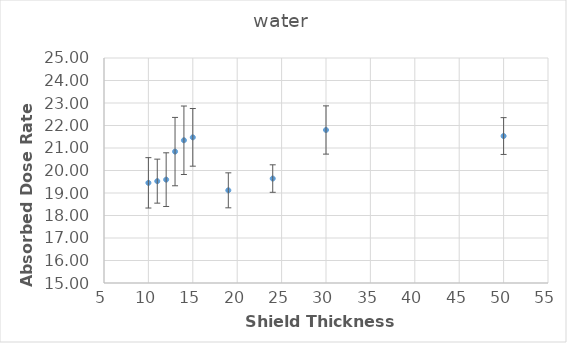
| Category | water |
|---|---|
| 10.0 | 19.451 |
| 11.0 | 19.527 |
| 12.0 | 19.593 |
| 13.0 | 20.84 |
| 14.0 | 21.344 |
| 15.0 | 21.473 |
| 19.0 | 19.119 |
| 24.0 | 19.642 |
| 30.0 | 21.8 |
| 50.0 | 21.532 |